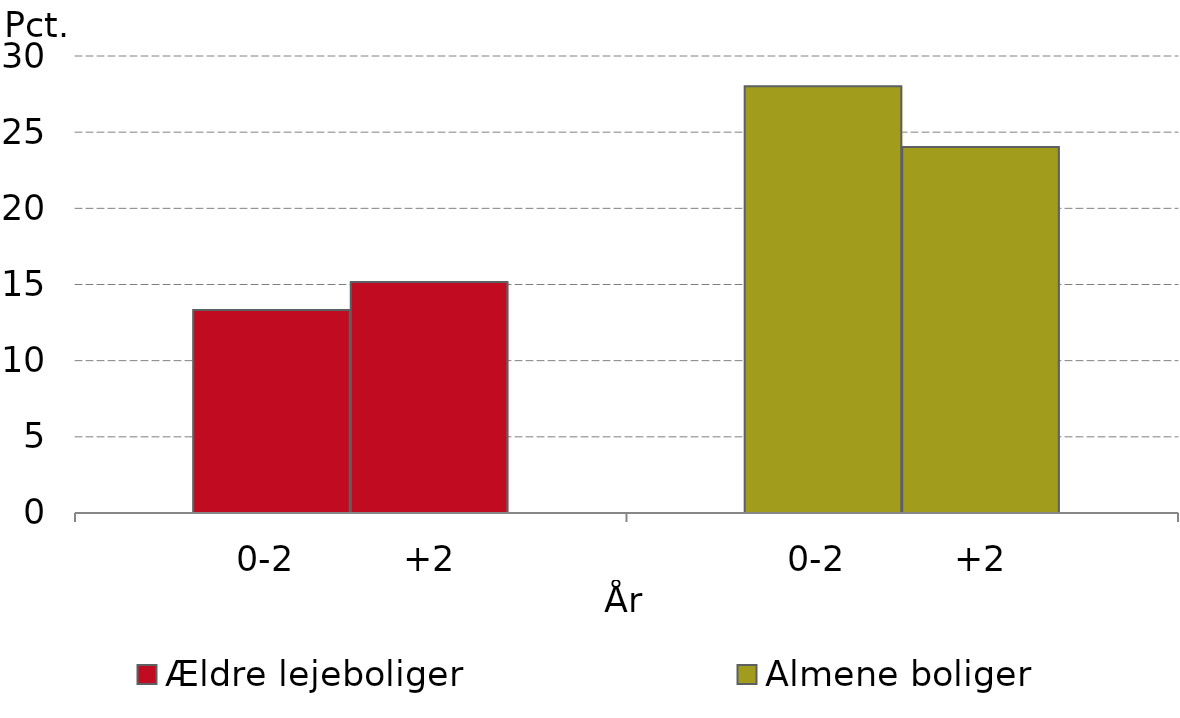
| Category |  Ældre lejeboliger | Almene boliger |
|---|---|---|
| 0-2          +2 | 13.331 | 15.16 |
| 0-2          +2 | 28.007 | 24.025 |